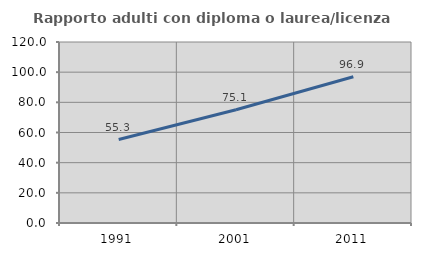
| Category | Rapporto adulti con diploma o laurea/licenza media  |
|---|---|
| 1991.0 | 55.342 |
| 2001.0 | 75.052 |
| 2011.0 | 96.918 |